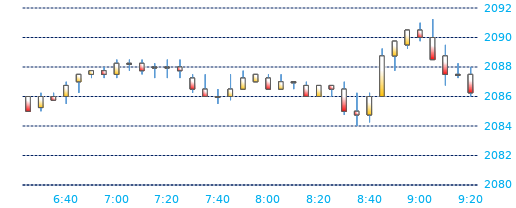
| Category | Series 0 | Series 1 | Series 2 | Series 3 |
|---|---|---|---|---|
| 2016-04-26 09:20:00 | 2087.5 | 2088 | 2086 | 2086.25 |
| 2016-04-26 09:15:00 | 2087.5 | 2088.25 | 2087.25 | 2087.5 |
| 2016-04-26 09:10:00 | 2088.75 | 2089.5 | 2086.75 | 2087.5 |
| 2016-04-26 09:05:00 | 2090 | 2091.25 | 2088.5 | 2088.5 |
| 2016-04-26 09:00:00 | 2090.5 | 2091 | 2089.75 | 2090 |
| 2016-04-26 08:55:00 | 2089.5 | 2090.5 | 2089.25 | 2090.5 |
| 2016-04-26 08:50:00 | 2088.75 | 2089.75 | 2087.75 | 2089.75 |
| 2016-04-26 08:45:00 | 2086 | 2089.25 | 2086 | 2088.75 |
| 2016-04-26 08:40:00 | 2084.75 | 2086.25 | 2084.25 | 2086 |
| 2016-04-26 08:35:00 | 2085 | 2086.25 | 2084 | 2084.75 |
| 2016-04-26 08:30:00 | 2086.5 | 2087 | 2084.75 | 2085 |
| 2016-04-26 08:25:00 | 2086.75 | 2086.75 | 2086 | 2086.5 |
| 2016-04-26 08:20:00 | 2086 | 2086.75 | 2086 | 2086.75 |
| 2016-04-26 08:15:00 | 2086.75 | 2087 | 2086 | 2086 |
| 2016-04-26 08:10:00 | 2087 | 2087 | 2086.5 | 2087 |
| 2016-04-26 08:05:00 | 2086.5 | 2087.5 | 2086.5 | 2087 |
| 2016-04-26 08:00:00 | 2087.25 | 2087.5 | 2086.5 | 2086.5 |
| 2016-04-26 07:55:00 | 2087 | 2087.5 | 2087 | 2087.5 |
| 2016-04-26 07:50:00 | 2086.5 | 2087.75 | 2086.5 | 2087.25 |
| 2016-04-26 07:45:00 | 2086 | 2087.5 | 2085.75 | 2086.5 |
| 2016-04-26 07:40:00 | 2086 | 2086.5 | 2085.5 | 2086 |
| 2016-04-26 07:35:00 | 2086.5 | 2087.5 | 2086 | 2086 |
| 2016-04-26 07:30:00 | 2087.25 | 2087.5 | 2086.25 | 2086.5 |
| 2016-04-26 07:25:00 | 2088 | 2088.5 | 2087.25 | 2087.75 |
| 2016-04-26 07:20:00 | 2088 | 2088.5 | 2087.25 | 2088 |
| 2016-04-26 07:15:00 | 2088 | 2088.25 | 2087.25 | 2088 |
| 2016-04-26 07:10:00 | 2088.25 | 2088.5 | 2087.5 | 2087.75 |
| 2016-04-26 07:05:00 | 2088.25 | 2088.5 | 2087.75 | 2088.25 |
| 2016-04-26 07:00:00 | 2087.5 | 2088.5 | 2087.25 | 2088.25 |
| 2016-04-26 06:55:00 | 2087.75 | 2088 | 2087.25 | 2087.5 |
| 2016-04-26 06:50:00 | 2087.5 | 2087.75 | 2087.25 | 2087.75 |
| 2016-04-26 06:45:00 | 2087 | 2087.5 | 2086.25 | 2087.5 |
| 2016-04-26 06:40:00 | 2086 | 2087 | 2085.5 | 2086.75 |
| 2016-04-26 06:35:00 | 2086 | 2086.25 | 2085.75 | 2085.75 |
| 2016-04-26 06:30:00 | 2085.25 | 2086.25 | 2085 | 2086 |
| 2016-04-26 06:25:00 | 2086 | 2086 | 2085 | 2085 |